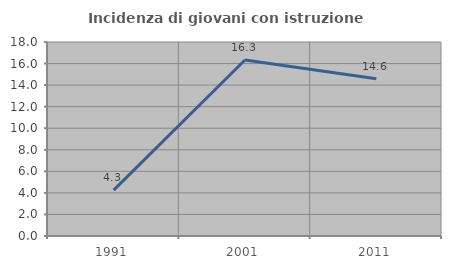
| Category | Incidenza di giovani con istruzione universitaria |
|---|---|
| 1991.0 | 4.255 |
| 2001.0 | 16.327 |
| 2011.0 | 14.583 |